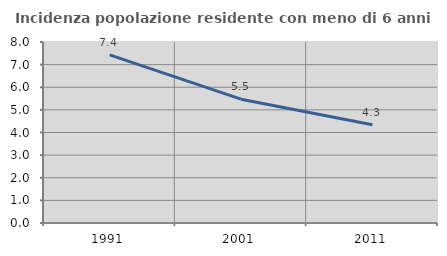
| Category | Incidenza popolazione residente con meno di 6 anni |
|---|---|
| 1991.0 | 7.433 |
| 2001.0 | 5.472 |
| 2011.0 | 4.342 |